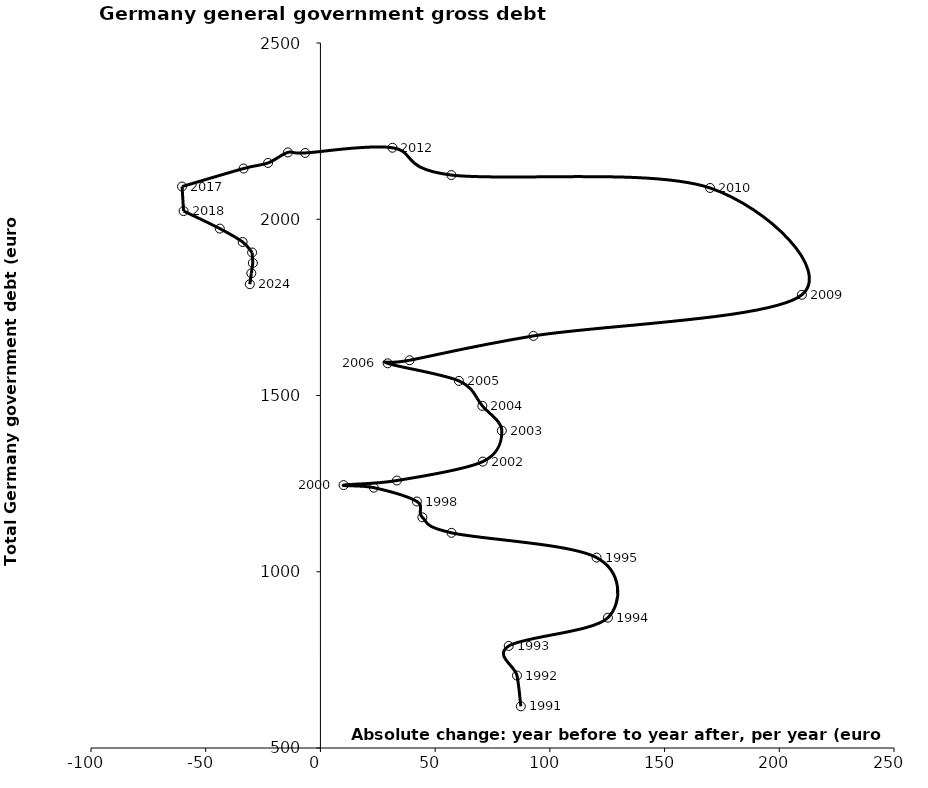
| Category | Series 0 |
|---|---|
| 87.35000000000002 | 618.217 |
| 85.67650000000003 | 705.567 |
| 82.07350000000002 | 789.57 |
| 125.31 | 869.714 |
| 120.363 | 1040.19 |
| 57.13499999999999 | 1110.44 |
| 44.41999999999996 | 1154.46 |
| 42.05499999999995 | 1199.28 |
| 23.254999999999995 | 1238.57 |
| 10.090000000000032 | 1245.79 |
| 33.33000000000004 | 1258.75 |
| 70.755 | 1312.45 |
| 79.06999999999994 | 1400.26 |
| 70.57000000000005 | 1470.59 |
| 60.370000000000005 | 1541.4 |
| 29.309999999999945 | 1591.33 |
| 38.85500000000002 | 1600.02 |
| 92.83000000000004 | 1669.04 |
| 209.83999999999992 | 1785.68 |
| 169.83000000000004 | 2088.72 |
| 57.070000000000164 | 2125.34 |
| 31.394999999999982 | 2202.86 |
| -6.644999999999982 | 2188.13 |
| -14.190000000000055 | 2189.57 |
| -22.835000000000036 | 2159.75 |
| -33.4849999999999 | 2143.9 |
| -60.315000000000055 | 2092.78 |
| -59.645000000000095 | 2023.27 |
| -43.860000000000014 | 1973.49 |
| -33.914999999999964 | 1935.55 |
| -29.779999999999973 | 1905.66 |
| -29.450000000000045 | 1875.99 |
| -30.11500000000001 | 1846.76 |
| -30.779999999999973 | 1815.76 |